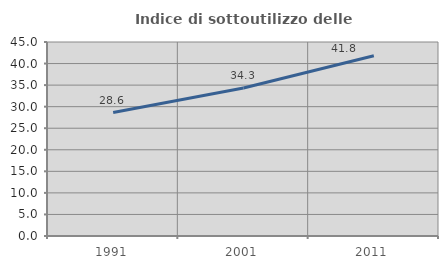
| Category | Indice di sottoutilizzo delle abitazioni  |
|---|---|
| 1991.0 | 28.638 |
| 2001.0 | 34.326 |
| 2011.0 | 41.809 |